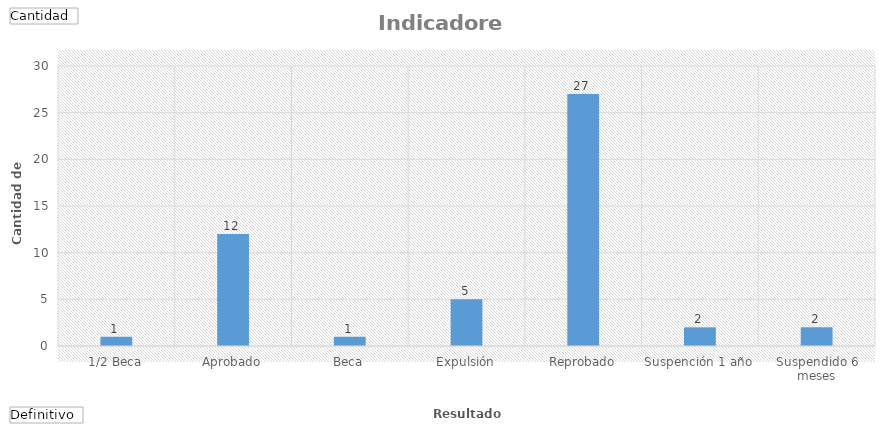
| Category | Total |
|---|---|
| 1/2 Beca | 1 |
| Aprobado | 12 |
| Beca | 1 |
| Expulsión | 5 |
| Reprobado | 27 |
| Suspención 1 año | 2 |
| Suspendido 6 meses | 2 |